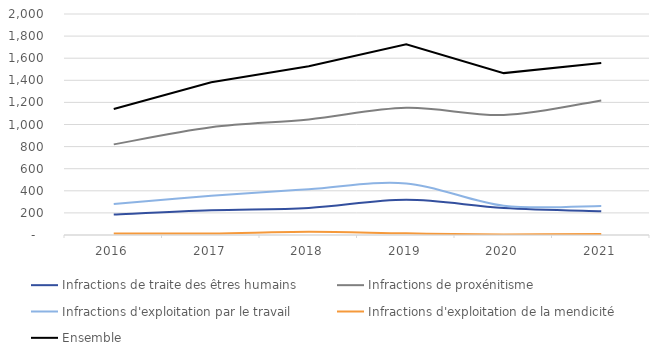
| Category | Infractions de traite des êtres humains | Infractions de proxénitisme | Infractions d'exploitation par le travail | Infractions d'exploitation de la mendicité | Ensemble |
|---|---|---|---|---|---|
| 2016.0 | 185 | 820 | 280 | 14 | 1141 |
| 2017.0 | 224 | 975 | 355 | 14 | 1383 |
| 2018.0 | 245 | 1046 | 414 | 29 | 1528 |
| 2019.0 | 318 | 1151 | 467 | 15 | 1727 |
| 2020.0 | 245 | 1086 | 265 | 5 | 1465 |
| 2021.0 | 215 | 1218 | 263 | 10 | 1556 |